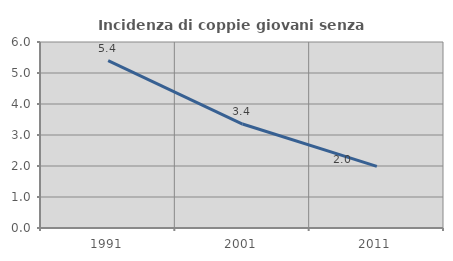
| Category | Incidenza di coppie giovani senza figli |
|---|---|
| 1991.0 | 5.398 |
| 2001.0 | 3.354 |
| 2011.0 | 1.987 |